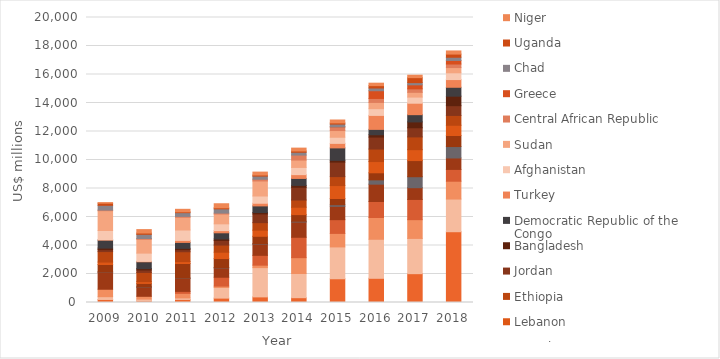
| Category | Yemen | Syria | Iraq | South Sudan | Palestine | Nigeria | Somalia | Lebanon | Ethiopia | Jordan | Bangladesh | Democratic Republic of the Congo  | Turkey | Afghanistan | Sudan | Central African Republic | Greece | Chad | Uganda | Niger |
|---|---|---|---|---|---|---|---|---|---|---|---|---|---|---|---|---|---|---|---|---|
| 2009.0 | 212.973 | 194.075 | 522.389 | 0 | 1206.222 | 6.835 | 523.417 | 171.046 | 735.413 | 135.772 | 109.582 | 562.117 | 20.92 | 649.817 | 1392.515 | 43.408 | 0 | 334.162 | 148.842 | 38.48 |
| 2010.0 | 116.765 | 122.395 | 194.948 | 0 | 643.166 | 12.633 | 249.295 | 124.622 | 646.412 | 171.077 | 97.983 | 478.06 | 29.511 | 578.751 | 971.414 | 52.436 | 0 | 295.561 | 90.386 | 240.653 |
| 2011.0 | 214.678 | 106.551 | 321.678 | 136.77 | 916.517 | 17.649 | 1023.581 | 131.34 | 691.746 | 146.415 | 92.379 | 416.781 | 142.16 | 729.071 | 893.84 | 62.314 | 0 | 261.235 | 56.738 | 178.052 |
| 2012.0 | 307.152 | 748.788 | 95.198 | 621.085 | 655.26 | 20.254 | 637.556 | 442.214 | 501.132 | 325.778 | 105.119 | 432.322 | 151.708 | 476.648 | 689.255 | 65.075 | 0 | 298.255 | 71.79 | 285.766 |
| 2013.0 | 393.484 | 2054.871 | 171.345 | 690.291 | 785.341 | 28.566 | 522.383 | 428.558 | 528.565 | 611.388 | 102.091 | 461.802 | 186.271 | 508.503 | 1055.358 | 120.708 | 0 | 220.782 | 75.348 | 205.094 |
| 2014.0 | 336.844 | 1697.275 | 1112.615 | 1430.861 | 1072.211 | 50.553 | 468.106 | 516.425 | 506.041 | 895.001 | 131.492 | 488.793 | 266.562 | 505.82 | 518.138 | 349.406 | 0 | 196.25 | 91.1 | 200.547 |
| 2015.0 | 1666.343 | 2234.682 | 947.5 | 963.918 | 939.199 | 109.155 | 436.83 | 907.267 | 629.253 | 1016.833 | 123.894 | 874.191 | 317.95 | 430.453 | 469.191 | 256.316 | 2.871 | 193.234 | 83.409 | 204.829 |
| 2016.0 | 1698.306 | 2738.972 | 1527.762 | 1121.747 | 1217.135 | 301.63 | 497.308 | 787.385 | 876.983 | 839.788 | 166.183 | 375.686 | 980.492 | 472.694 | 435.865 | 280.369 | 542.699 | 190.789 | 165.788 | 173.594 |
| 2017.0 | 2023.234 | 2473.992 | 1315.771 | 1418.87 | 824.174 | 770.712 | 1133.196 | 764.387 | 896.045 | 640.215 | 413.019 | 507.763 | 803.431 | 430.034 | 334.02 | 243.902 | 283.588 | 152.666 | 350.352 | 171.613 |
| 2018.0 | 4966.938 | 2292.021 | 1251.465 | 828.464 | 803.544 | 801.155 | 774.121 | 718.31 | 691.416 | 683.17 | 668.441 | 624.65 | 540.975 | 474.891 | 365.69 | 250.363 | 250.261 | 224.438 | 222.708 | 219.815 |